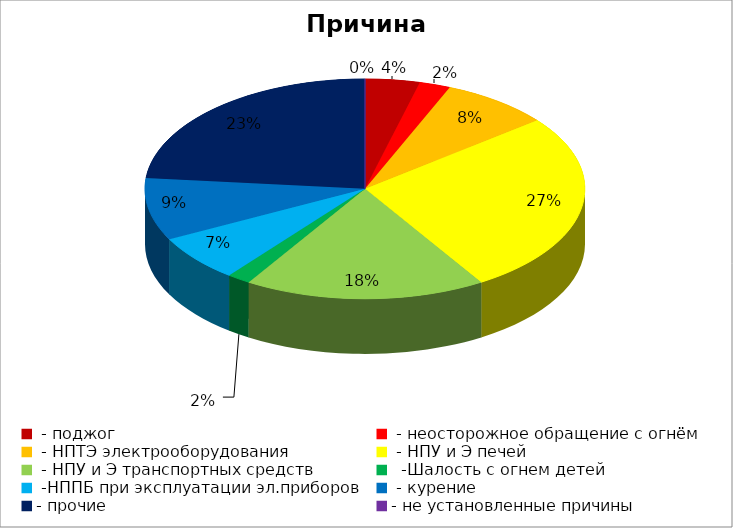
| Category | Причина пожара |
|---|---|
|  - поджог | 7 |
|  - неосторожное обращение с огнём | 4 |
|  - НПТЭ электрооборудования | 14 |
|  - НПУ и Э печей | 47 |
|  - НПУ и Э транспортных средств | 31 |
|   -Шалость с огнем детей | 3 |
|  -НППБ при эксплуатации эл.приборов | 12 |
|  - курение | 16 |
| - прочие | 41 |
| - не установленные причины | 0 |